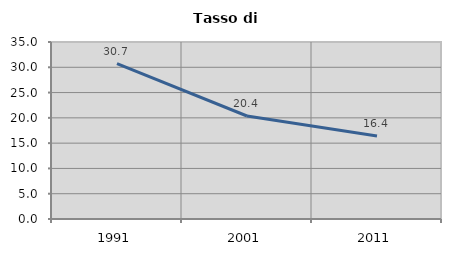
| Category | Tasso di disoccupazione   |
|---|---|
| 1991.0 | 30.729 |
| 2001.0 | 20.37 |
| 2011.0 | 16.431 |